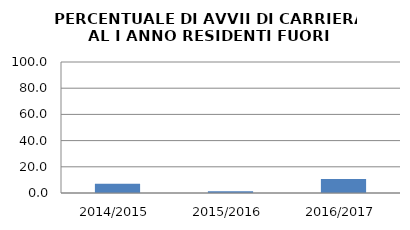
| Category | 2014/2015 2015/2016 2016/2017 |
|---|---|
| 2014/2015 | 7.059 |
| 2015/2016 | 1.37 |
| 2016/2017 | 10.714 |